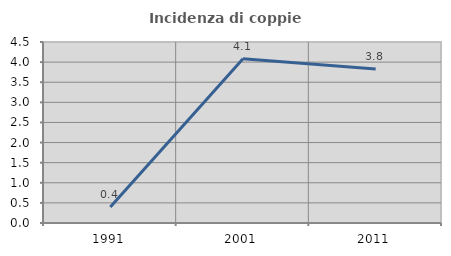
| Category | Incidenza di coppie miste |
|---|---|
| 1991.0 | 0.398 |
| 2001.0 | 4.085 |
| 2011.0 | 3.828 |